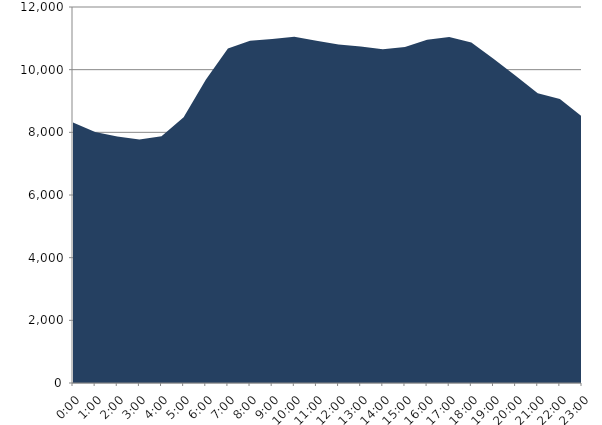
| Category | Series 0 | Series 1 |
|---|---|---|
| 2018-12-19 |  | 8310.07 |
| 2018-12-19 01:00:00 |  | 8009.67 |
| 2018-12-19 02:00:00 |  | 7867.77 |
| 2018-12-19 03:00:00 |  | 7772.05 |
| 2018-12-19 04:00:00 |  | 7875.25 |
| 2018-12-19 05:00:00 |  | 8480.2 |
| 2018-12-19 06:00:00 |  | 9681.1 |
| 2018-12-19 07:00:00 |  | 10673.59 |
| 2018-12-19 08:00:00 |  | 10920.4 |
| 2018-12-19 09:00:00 |  | 10980.51 |
| 2018-12-19 10:00:00 |  | 11047.25 |
| 2018-12-19 11:00:00 |  | 10925.95 |
| 2018-12-19 12:00:00 |  | 10804.92 |
| 2018-12-19 13:00:00 |  | 10742.5 |
| 2018-12-19 14:00:00 |  | 10652.07 |
| 2018-12-19 15:00:00 |  | 10723.89 |
| 2018-12-19 16:00:00 |  | 10956.81 |
| 2018-12-19 17:00:00 |  | 11044.25 |
| 2018-12-19 18:00:00 |  | 10864.4 |
| 2018-12-19 19:00:00 |  | 10347.82 |
| 2018-12-19 20:00:00 |  | 9806.52 |
| 2018-12-19 21:00:00 |  | 9243.81 |
| 2018-12-19 22:00:00 |  | 9060.56 |
| 2018-12-19 23:00:00 |  | 8502.57 |